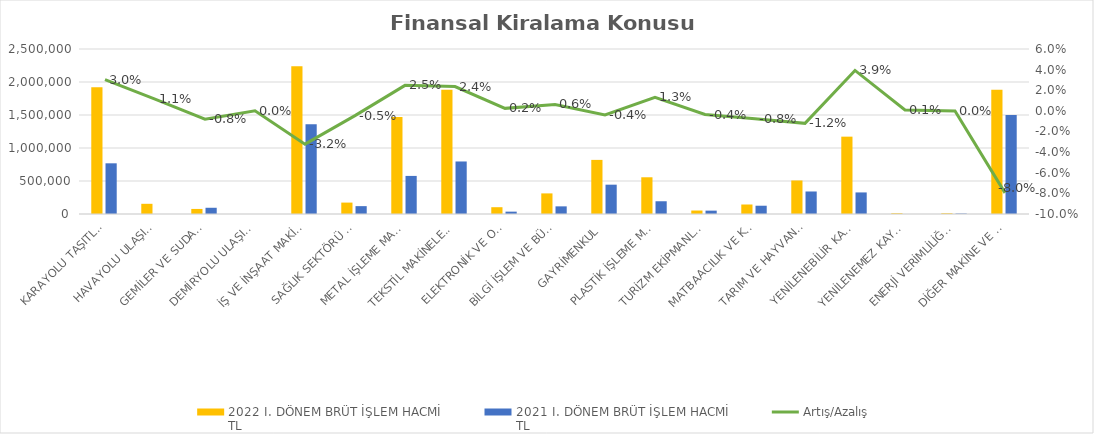
| Category | 2022 I. DÖNEM BRÜT İŞLEM HACMİ 
TL | 2021 I. DÖNEM BRÜT İŞLEM HACMİ 
TL |
|---|---|---|
| KARAYOLU TAŞITLARI | 1919451.275 | 767981.911 |
| HAVAYOLU ULAŞIM ARAÇLARI | 154435 | 0 |
| GEMİLER VE SUDA YÜZEN TAŞIT VE ARAÇLAR | 76669 | 94401.142 |
| DEMİRYOLU ULAŞIM ARAÇLARI | 0 | 0 |
| İŞ VE İNŞAAT MAKİNELERİ | 2239554.344 | 1359749.597 |
| SAĞLIK SEKTÖRÜ VE ESTETİK EKİPMANLARI | 172860.711 | 119184.164 |
| METAL İŞLEME MAKİNELERİ | 1468984.044 | 577018.97 |
| TEKSTİL MAKİNELERİ | 1883319.779 | 795861.151 |
| ELEKTRONİK VE OPTİK CİHAZLAR | 102963.667 | 35602.411 |
| BİLGİ İŞLEM VE BÜRO SİSTEMLERİ | 312224.365 | 115852.498 |
| GAYRİMENKUL | 819868.423 | 444380 |
| PLASTİK İŞLEME MAKİNELERİ | 556428.832 | 193063.532 |
| TURİZM EKİPMANLARI | 52656.719 | 51005.432 |
| MATBAACILIK VE KAĞIT İŞLEME MAKİNELERİ | 143880.669 | 125323.531 |
| TARIM VE HAYVANCILIK MAKİNELERİ | 508036.8 | 341134.489 |
| YENİLENEBİLİR KAYNAKLI ELEKTRİK ENERJİSİ ÜRETİM EKİPMANLARI | 1171947.614 | 326876.988 |
| YENİLENEMEZ KAYNAKLI ELEKTRİK ENERJİSİ ÜRETİM EKİPMANLARI | 11337 | 0 |
| ENERJİ VERİMLİLİĞİ EKİPMANLARI | 11273.342 | 6933.265 |
| DİĞER MAKİNE VE EKİPMANLAR | 1882207.155 | 1501874.248 |